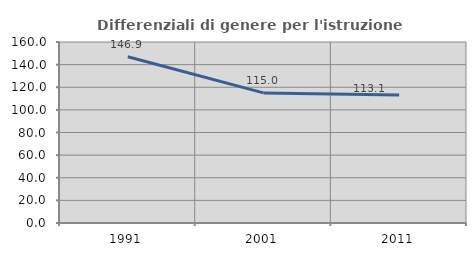
| Category | Differenziali di genere per l'istruzione superiore |
|---|---|
| 1991.0 | 146.92 |
| 2001.0 | 115.005 |
| 2011.0 | 113.128 |